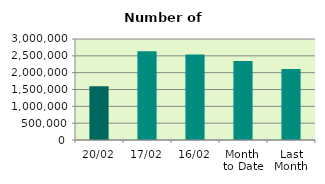
| Category | Series 0 |
|---|---|
| 20/02 | 1596322 |
| 17/02 | 2638626 |
| 16/02 | 2539686 |
| Month 
to Date | 2343754 |
| Last
Month | 2107310.455 |